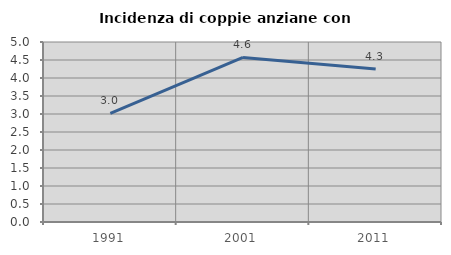
| Category | Incidenza di coppie anziane con figli |
|---|---|
| 1991.0 | 3.016 |
| 2001.0 | 4.572 |
| 2011.0 | 4.253 |